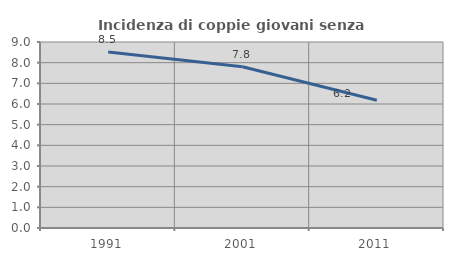
| Category | Incidenza di coppie giovani senza figli |
|---|---|
| 1991.0 | 8.519 |
| 2001.0 | 7.803 |
| 2011.0 | 6.181 |